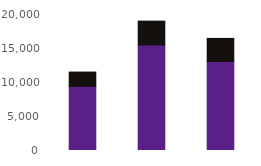
| Category | Online | Telephony |
|---|---|---|
| Dec23 | 9449 | 2086 |
| Jan24 | 15521 | 3504 |
| Feb24 | 13096 | 3390 |